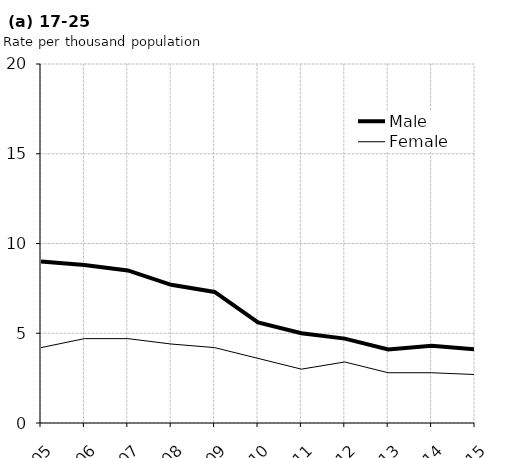
| Category | Male | Female |
|---|---|---|
| 2005.0 | 9 | 4.2 |
| 2006.0 | 8.8 | 4.7 |
| 2007.0 | 8.5 | 4.7 |
| 2008.0 | 7.7 | 4.4 |
| 2009.0 | 7.3 | 4.2 |
| 2010.0 | 5.6 | 3.6 |
| 2011.0 | 5 | 3 |
| 2012.0 | 4.7 | 3.4 |
| 2013.0 | 4.1 | 2.8 |
| 2014.0 | 4.3 | 2.8 |
| 2015.0 | 4.1 | 2.7 |